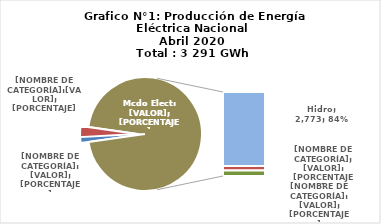
| Category | Series 0 |
|---|---|
| 0 | 46.112 |
| 1 | 102.637 |
| 2 | 2772.762 |
| 3 | 163.427 |
| 4 | 205.968 |